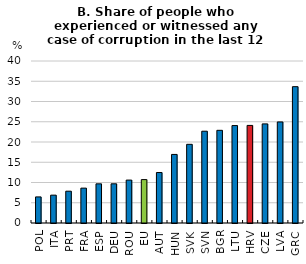
| Category | Share of people who personnaly know anyone who takes or has taken bribes |
|---|---|
| POL | 6.442 |
| ITA | 6.876 |
| PRT | 7.853 |
| FRA | 8.607 |
| ESP | 9.671 |
| DEU | 9.677 |
| ROU | 10.597 |
| EU | 10.717 |
| AUT | 12.463 |
| HUN | 16.929 |
| SVK | 19.425 |
| SVN | 22.664 |
| BGR | 22.885 |
| LTU | 24.056 |
| HRV | 24.096 |
| CZE | 24.468 |
| LVA | 24.951 |
| GRC | 33.662 |